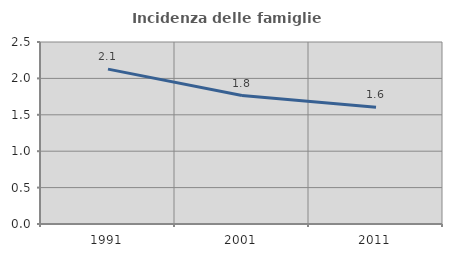
| Category | Incidenza delle famiglie numerose |
|---|---|
| 1991.0 | 2.128 |
| 2001.0 | 1.765 |
| 2011.0 | 1.604 |